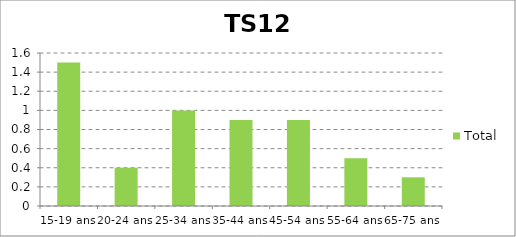
| Category | Total |
|---|---|
| 15-19 ans | 1.5 |
| 20-24 ans | 0.4 |
| 25-34 ans | 1 |
| 35-44 ans | 0.9 |
| 45-54 ans | 0.9 |
| 55-64 ans | 0.5 |
| 65-75 ans | 0.3 |